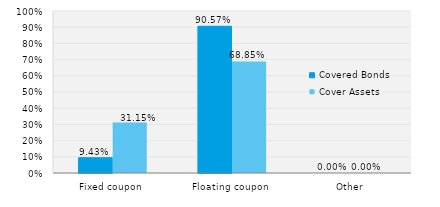
| Category | Covered Bonds | Cover Assets |
|---|---|---|
| Fixed coupon | 0.094 | 0.311 |
| Floating coupon | 0.906 | 0.689 |
| Other | 0 | 0 |